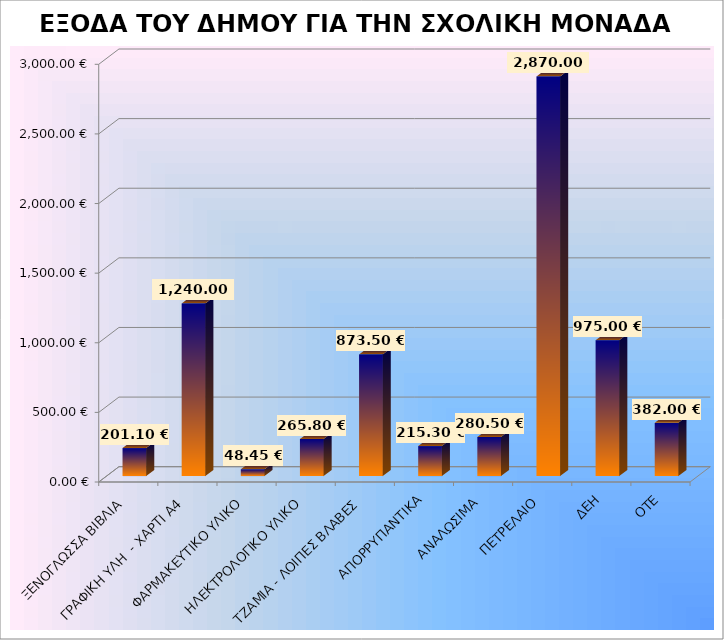
| Category | ΠΟΣΟ |
|---|---|
| ΞΕΝΟΓΛΩΣΣΑ ΒΙΒΛΙΑ | 201.1 |
| ΓΡΑΦΙΚΗ ΥΛΗ  - ΧΑΡΤΙ Α4 | 1240 |
| ΦΑΡΜΑΚΕΥΤΙΚΟ ΥΛΙΚΟ | 48.45 |
| ΗΛΕΚΤΡΟΛΟΓΙΚΟ ΥΛΙΚΟ | 265.8 |
| ΤΖΑΜΙΑ - ΛΟΙΠΕΣ ΒΛΑΒΕΣ | 873.5 |
| ΑΠΟΡΡΥΠΑΝΤΙΚΑ | 215.3 |
| ΑΝΑΛΩΣΙΜΑ | 280.5 |
| ΠΕΤΡΕΛΑΙΟ | 2870 |
| ΔΕΗ | 975 |
| ΟΤΕ | 382 |